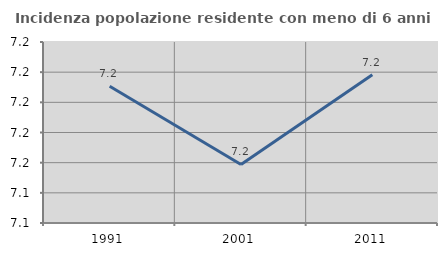
| Category | Incidenza popolazione residente con meno di 6 anni |
|---|---|
| 1991.0 | 7.211 |
| 2001.0 | 7.159 |
| 2011.0 | 7.218 |